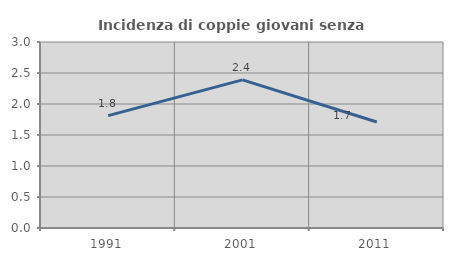
| Category | Incidenza di coppie giovani senza figli |
|---|---|
| 1991.0 | 1.813 |
| 2001.0 | 2.389 |
| 2011.0 | 1.709 |